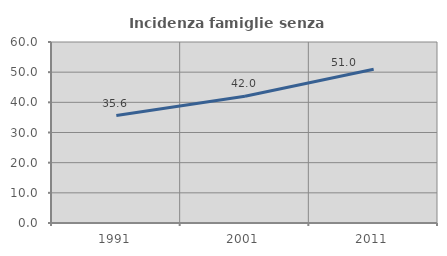
| Category | Incidenza famiglie senza nuclei |
|---|---|
| 1991.0 | 35.628 |
| 2001.0 | 42.009 |
| 2011.0 | 50.952 |